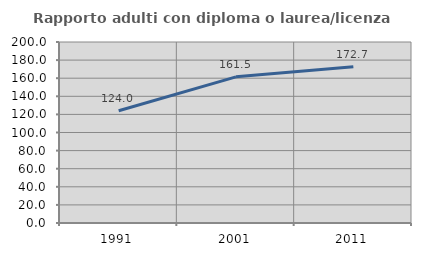
| Category | Rapporto adulti con diploma o laurea/licenza media  |
|---|---|
| 1991.0 | 124 |
| 2001.0 | 161.502 |
| 2011.0 | 172.727 |